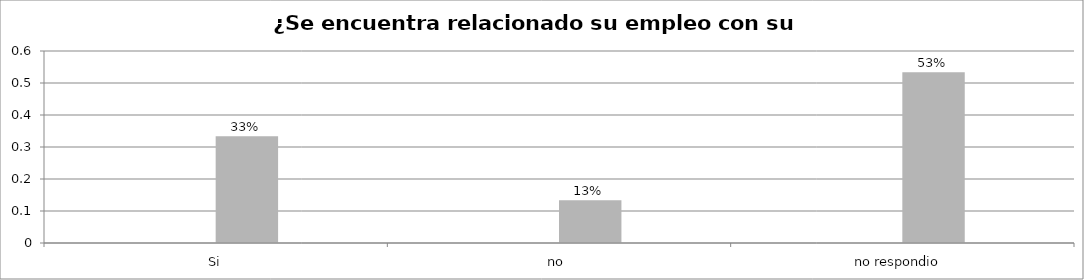
| Category | Series 0 | Series 1 | Series 2 | Series 3 |
|---|---|---|---|---|
| Si |  |  | 0.333 |  |
| no  |  |  | 0.133 |  |
| no respondio  |  |  | 0.533 |  |